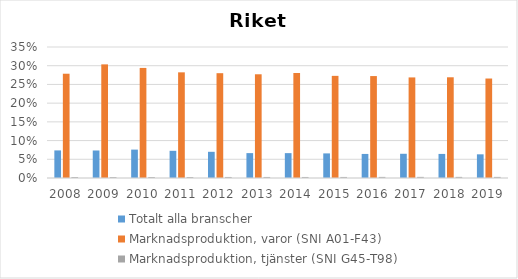
| Category | Totalt alla branscher | Marknadsproduktion, varor (SNI A01-F43) | Marknadsproduktion, tjänster (SNI G45-T98) |
|---|---|---|---|
| 2008 | 0.074 | 0.279 | 0.003 |
| 2009 | 0.073 | 0.304 | 0.003 |
| 2010 | 0.076 | 0.294 | 0.003 |
| 2011 | 0.073 | 0.282 | 0.003 |
| 2012 | 0.07 | 0.28 | 0.003 |
| 2013 | 0.066 | 0.277 | 0.003 |
| 2014 | 0.066 | 0.281 | 0.003 |
| 2015 | 0.066 | 0.273 | 0.003 |
| 2016 | 0.064 | 0.272 | 0.003 |
| 2017 | 0.065 | 0.269 | 0.003 |
| 2018 | 0.064 | 0.269 | 0.003 |
| 2019 | 0.063 | 0.266 | 0.003 |